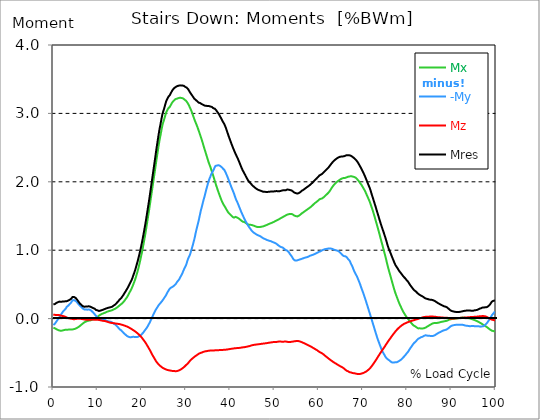
| Category |  Mx |  -My |  Mz |  Mres |
|---|---|---|---|---|
| 0.0 | -0.133 | -0.093 | 0.055 | 0.208 |
| 0.167348456675344 | -0.137 | -0.086 | 0.055 | 0.209 |
| 0.334696913350688 | -0.141 | -0.076 | 0.055 | 0.212 |
| 0.5020453700260321 | -0.148 | -0.061 | 0.052 | 0.222 |
| 0.669393826701376 | -0.154 | -0.045 | 0.052 | 0.228 |
| 0.83674228337672 | -0.159 | -0.029 | 0.052 | 0.236 |
| 1.0040907400520642 | -0.165 | -0.014 | 0.052 | 0.239 |
| 1.1621420602454444 | -0.17 | 0.001 | 0.053 | 0.244 |
| 1.3294905169207885 | -0.174 | 0.018 | 0.051 | 0.248 |
| 1.4968389735961325 | -0.176 | 0.035 | 0.047 | 0.246 |
| 1.6641874302714765 | -0.177 | 0.052 | 0.044 | 0.245 |
| 1.8315358869468206 | -0.176 | 0.069 | 0.041 | 0.245 |
| 1.9988843436221646 | -0.175 | 0.086 | 0.039 | 0.248 |
| 2.1662328002975086 | -0.173 | 0.102 | 0.037 | 0.249 |
| 2.333581256972853 | -0.169 | 0.115 | 0.035 | 0.249 |
| 2.5009297136481967 | -0.166 | 0.125 | 0.031 | 0.252 |
| 2.6682781703235405 | -0.163 | 0.137 | 0.028 | 0.253 |
| 2.8356266269988843 | -0.161 | 0.149 | 0.023 | 0.253 |
| 3.002975083674229 | -0.163 | 0.171 | 0.016 | 0.254 |
| 3.1703235403495724 | -0.162 | 0.178 | 0.013 | 0.259 |
| 3.337671997024917 | -0.161 | 0.187 | 0.008 | 0.263 |
| 3.4957233172182973 | -0.16 | 0.197 | 0.005 | 0.268 |
| 3.663071773893641 | -0.16 | 0.21 | 0.002 | 0.275 |
| 3.8304202305689854 | -0.159 | 0.222 | 0.001 | 0.281 |
| 3.997768687244329 | -0.158 | 0.234 | -0.002 | 0.289 |
| 4.165117143919673 | -0.158 | 0.251 | -0.004 | 0.303 |
| 4.332465600595017 | -0.158 | 0.268 | -0.006 | 0.316 |
| 4.499814057270361 | -0.156 | 0.273 | -0.007 | 0.32 |
| 4.667162513945706 | -0.154 | 0.271 | -0.01 | 0.316 |
| 4.834510970621049 | -0.152 | 0.266 | -0.011 | 0.312 |
| 5.001859427296393 | -0.148 | 0.26 | -0.006 | 0.304 |
| 5.169207883971737 | -0.141 | 0.252 | -0.004 | 0.293 |
| 5.336556340647081 | -0.136 | 0.24 | -0.003 | 0.28 |
| 5.503904797322425 | -0.13 | 0.226 | -0.003 | 0.264 |
| 5.671253253997769 | -0.123 | 0.212 | -0.002 | 0.249 |
| 5.82930457419115 | -0.116 | 0.202 | -0.003 | 0.237 |
| 5.996653030866494 | -0.107 | 0.188 | -0.003 | 0.221 |
| 6.164001487541838 | -0.099 | 0.178 | -0.004 | 0.209 |
| 6.331349944217181 | -0.089 | 0.17 | -0.004 | 0.2 |
| 6.498698400892526 | -0.08 | 0.158 | -0.006 | 0.19 |
| 6.66604685756787 | -0.071 | 0.148 | -0.008 | 0.182 |
| 6.833395314243213 | -0.063 | 0.139 | -0.011 | 0.176 |
| 7.000743770918558 | -0.055 | 0.134 | -0.013 | 0.173 |
| 7.168092227593902 | -0.05 | 0.132 | -0.015 | 0.174 |
| 7.335440684269246 | -0.045 | 0.133 | -0.016 | 0.176 |
| 7.50278914094459 | -0.04 | 0.132 | -0.017 | 0.176 |
| 7.6701375976199335 | -0.035 | 0.131 | -0.018 | 0.176 |
| 7.837486054295278 | -0.032 | 0.133 | -0.018 | 0.178 |
| 7.995537374488658 | -0.03 | 0.134 | -0.018 | 0.18 |
| 8.162885831164003 | -0.029 | 0.132 | -0.016 | 0.178 |
| 8.330234287839346 | -0.027 | 0.127 | -0.016 | 0.175 |
| 8.49758274451469 | -0.024 | 0.121 | -0.016 | 0.17 |
| 8.664931201190035 | -0.02 | 0.11 | -0.015 | 0.165 |
| 8.832279657865378 | -0.015 | 0.101 | -0.014 | 0.157 |
| 8.999628114540721 | -0.01 | 0.089 | -0.015 | 0.154 |
| 9.166976571216066 | -0.005 | 0.076 | -0.016 | 0.151 |
| 9.334325027891412 | 0.001 | 0.064 | -0.016 | 0.144 |
| 9.501673484566755 | 0.007 | 0.05 | -0.015 | 0.134 |
| 9.669021941242098 | 0.013 | 0.038 | -0.016 | 0.125 |
| 9.836370397917442 | 0.02 | 0.027 | -0.016 | 0.122 |
| 10.003718854592787 | 0.027 | 0.014 | -0.018 | 0.12 |
| 10.17106731126813 | 0.034 | 0 | -0.018 | 0.115 |
| 10.329118631461512 | 0.045 | -0.017 | -0.019 | 0.111 |
| 10.496467088136853 | 0.052 | -0.021 | -0.021 | 0.115 |
| 10.663815544812199 | 0.058 | -0.019 | -0.024 | 0.118 |
| 10.831164001487544 | 0.063 | -0.01 | -0.028 | 0.119 |
| 10.998512458162887 | 0.069 | -0.006 | -0.03 | 0.124 |
| 11.16586091483823 | 0.074 | -0.005 | -0.031 | 0.131 |
| 11.333209371513574 | 0.077 | -0.007 | -0.033 | 0.133 |
| 11.50055782818892 | 0.082 | -0.012 | -0.034 | 0.137 |
| 11.667906284864264 | 0.086 | -0.019 | -0.036 | 0.141 |
| 11.835254741539607 | 0.09 | -0.024 | -0.038 | 0.145 |
| 12.00260319821495 | 0.097 | -0.032 | -0.041 | 0.15 |
| 12.169951654890292 | 0.102 | -0.037 | -0.045 | 0.155 |
| 12.337300111565641 | 0.105 | -0.038 | -0.049 | 0.157 |
| 12.504648568240984 | 0.108 | -0.039 | -0.053 | 0.159 |
| 12.662699888434362 | 0.111 | -0.044 | -0.056 | 0.162 |
| 12.830048345109708 | 0.114 | -0.045 | -0.059 | 0.165 |
| 12.997396801785053 | 0.117 | -0.047 | -0.062 | 0.168 |
| 13.164745258460396 | 0.12 | -0.051 | -0.064 | 0.17 |
| 13.33209371513574 | 0.124 | -0.058 | -0.065 | 0.175 |
| 13.499442171811083 | 0.13 | -0.067 | -0.066 | 0.183 |
| 13.666790628486426 | 0.136 | -0.076 | -0.067 | 0.192 |
| 13.834139085161771 | 0.139 | -0.079 | -0.069 | 0.197 |
| 14.001487541837117 | 0.144 | -0.086 | -0.071 | 0.206 |
| 14.16883599851246 | 0.152 | -0.097 | -0.072 | 0.217 |
| 14.336184455187803 | 0.159 | -0.107 | -0.074 | 0.229 |
| 14.503532911863147 | 0.168 | -0.119 | -0.075 | 0.24 |
| 14.670881368538492 | 0.176 | -0.132 | -0.077 | 0.253 |
| 14.828932688731873 | 0.185 | -0.142 | -0.08 | 0.264 |
| 14.996281145407215 | 0.194 | -0.157 | -0.081 | 0.28 |
| 15.163629602082558 | 0.203 | -0.166 | -0.083 | 0.291 |
| 15.330978058757903 | 0.211 | -0.171 | -0.087 | 0.299 |
| 15.498326515433247 | 0.22 | -0.18 | -0.09 | 0.313 |
| 15.665674972108594 | 0.23 | -0.195 | -0.093 | 0.33 |
| 15.833023428783937 | 0.241 | -0.206 | -0.097 | 0.346 |
| 16.00037188545928 | 0.255 | -0.218 | -0.1 | 0.364 |
| 16.167720342134626 | 0.269 | -0.227 | -0.104 | 0.381 |
| 16.335068798809967 | 0.285 | -0.236 | -0.108 | 0.398 |
| 16.502417255485312 | 0.299 | -0.245 | -0.111 | 0.416 |
| 16.669765712160658 | 0.315 | -0.256 | -0.116 | 0.435 |
| 16.837114168836 | 0.333 | -0.26 | -0.121 | 0.453 |
| 17.004462625511344 | 0.355 | -0.265 | -0.127 | 0.476 |
| 17.16251394570472 | 0.376 | -0.27 | -0.133 | 0.497 |
| 17.32986240238007 | 0.395 | -0.273 | -0.139 | 0.517 |
| 17.497210859055414 | 0.414 | -0.274 | -0.145 | 0.538 |
| 17.664559315730756 | 0.436 | -0.271 | -0.152 | 0.561 |
| 17.8319077724061 | 0.461 | -0.263 | -0.159 | 0.587 |
| 17.999256229081443 | 0.487 | -0.266 | -0.167 | 0.617 |
| 18.166604685756788 | 0.516 | -0.272 | -0.173 | 0.649 |
| 18.333953142432133 | 0.544 | -0.268 | -0.179 | 0.678 |
| 18.501301599107478 | 0.573 | -0.266 | -0.188 | 0.711 |
| 18.668650055782823 | 0.608 | -0.269 | -0.196 | 0.748 |
| 18.835998512458165 | 0.645 | -0.269 | -0.205 | 0.787 |
| 19.00334696913351 | 0.682 | -0.269 | -0.213 | 0.826 |
| 19.170695425808855 | 0.721 | -0.266 | -0.223 | 0.865 |
| 19.338043882484197 | 0.764 | -0.259 | -0.232 | 0.909 |
| 19.496095202677576 | 0.811 | -0.257 | -0.243 | 0.953 |
| 19.66344365935292 | 0.859 | -0.251 | -0.254 | 1.001 |
| 19.830792116028263 | 0.91 | -0.24 | -0.265 | 1.05 |
| 19.998140572703612 | 0.961 | -0.227 | -0.278 | 1.103 |
| 20.165489029378953 | 1.014 | -0.213 | -0.293 | 1.158 |
| 20.3328374860543 | 1.071 | -0.204 | -0.307 | 1.214 |
| 20.500185942729644 | 1.131 | -0.189 | -0.322 | 1.274 |
| 20.667534399404985 | 1.19 | -0.174 | -0.337 | 1.334 |
| 20.83488285608033 | 1.254 | -0.159 | -0.352 | 1.397 |
| 21.002231312755672 | 1.321 | -0.145 | -0.369 | 1.463 |
| 21.16957976943102 | 1.391 | -0.131 | -0.387 | 1.532 |
| 21.336928226106362 | 1.459 | -0.111 | -0.406 | 1.6 |
| 21.504276682781704 | 1.527 | -0.092 | -0.425 | 1.668 |
| 21.67162513945705 | 1.596 | -0.072 | -0.443 | 1.738 |
| 21.82967645965043 | 1.669 | -0.052 | -0.462 | 1.811 |
| 21.997024916325774 | 1.742 | -0.028 | -0.483 | 1.886 |
| 22.16437337300112 | 1.815 | -0.003 | -0.503 | 1.963 |
| 22.33172182967646 | 1.886 | 0.019 | -0.524 | 2.036 |
| 22.499070286351806 | 1.96 | 0.044 | -0.544 | 2.111 |
| 22.666418743027148 | 2.033 | 0.066 | -0.562 | 2.187 |
| 22.833767199702496 | 2.106 | 0.088 | -0.58 | 2.262 |
| 23.00111565637784 | 2.18 | 0.109 | -0.599 | 2.339 |
| 23.168464113053183 | 2.255 | 0.131 | -0.618 | 2.417 |
| 23.335812569728528 | 2.33 | 0.148 | -0.634 | 2.493 |
| 23.50316102640387 | 2.401 | 0.165 | -0.646 | 2.564 |
| 23.670509483079215 | 2.471 | 0.182 | -0.66 | 2.635 |
| 23.83785793975456 | 2.542 | 0.199 | -0.673 | 2.705 |
| 23.995909259947936 | 2.607 | 0.211 | -0.683 | 2.77 |
| 24.163257716623285 | 2.66 | 0.224 | -0.692 | 2.823 |
| 24.330606173298627 | 2.719 | 0.237 | -0.701 | 2.88 |
| 24.49795462997397 | 2.778 | 0.249 | -0.709 | 2.938 |
| 24.665303086649313 | 2.832 | 0.262 | -0.718 | 2.993 |
| 24.83265154332466 | 2.868 | 0.279 | -0.723 | 3.028 |
| 25.0 | 2.902 | 0.296 | -0.728 | 3.062 |
| 25.167348456675345 | 2.938 | 0.31 | -0.734 | 3.099 |
| 25.334696913350694 | 2.977 | 0.328 | -0.74 | 3.138 |
| 25.502045370026035 | 3.013 | 0.345 | -0.745 | 3.175 |
| 25.669393826701377 | 3.036 | 0.366 | -0.748 | 3.2 |
| 25.836742283376722 | 3.056 | 0.387 | -0.752 | 3.221 |
| 26.004090740052067 | 3.075 | 0.404 | -0.754 | 3.242 |
| 26.17143919672741 | 3.085 | 0.423 | -0.757 | 3.254 |
| 26.329490516920792 | 3.097 | 0.438 | -0.759 | 3.268 |
| 26.49683897359613 | 3.116 | 0.448 | -0.76 | 3.289 |
| 26.66418743027148 | 3.136 | 0.455 | -0.762 | 3.309 |
| 26.831535886946828 | 3.155 | 0.461 | -0.765 | 3.329 |
| 26.998884343622166 | 3.17 | 0.466 | -0.766 | 3.345 |
| 27.166232800297514 | 3.184 | 0.473 | -0.766 | 3.36 |
| 27.333581256972852 | 3.192 | 0.484 | -0.766 | 3.369 |
| 27.5009297136482 | 3.202 | 0.495 | -0.769 | 3.379 |
| 27.668278170323543 | 3.211 | 0.504 | -0.77 | 3.39 |
| 27.835626626998888 | 3.213 | 0.521 | -0.769 | 3.394 |
| 28.002975083674233 | 3.217 | 0.538 | -0.766 | 3.397 |
| 28.170323540349575 | 3.222 | 0.552 | -0.763 | 3.402 |
| 28.33767199702492 | 3.225 | 0.564 | -0.759 | 3.406 |
| 28.50502045370026 | 3.228 | 0.58 | -0.754 | 3.409 |
| 28.663071773893645 | 3.229 | 0.601 | -0.749 | 3.411 |
| 28.830420230568986 | 3.228 | 0.621 | -0.743 | 3.41 |
| 28.99776868724433 | 3.225 | 0.64 | -0.736 | 3.409 |
| 29.165117143919673 | 3.222 | 0.662 | -0.727 | 3.408 |
| 29.33246560059502 | 3.219 | 0.689 | -0.72 | 3.407 |
| 29.499814057270367 | 3.212 | 0.714 | -0.711 | 3.403 |
| 29.66716251394571 | 3.202 | 0.739 | -0.702 | 3.396 |
| 29.834510970621054 | 3.19 | 0.759 | -0.69 | 3.386 |
| 30.00185942729639 | 3.184 | 0.781 | -0.679 | 3.382 |
| 30.169207883971744 | 3.172 | 0.814 | -0.67 | 3.376 |
| 30.33655634064708 | 3.155 | 0.851 | -0.661 | 3.366 |
| 30.50390479732243 | 3.136 | 0.88 | -0.649 | 3.351 |
| 30.671253253997772 | 3.115 | 0.904 | -0.635 | 3.333 |
| 30.829304574191156 | 3.091 | 0.927 | -0.621 | 3.314 |
| 30.996653030866494 | 3.068 | 0.956 | -0.608 | 3.298 |
| 31.164001487541842 | 3.044 | 0.998 | -0.6 | 3.285 |
| 31.331349944217187 | 3.015 | 1.031 | -0.589 | 3.266 |
| 31.498698400892525 | 2.985 | 1.068 | -0.58 | 3.251 |
| 31.666046857567874 | 2.953 | 1.11 | -0.571 | 3.235 |
| 31.833395314243212 | 2.923 | 1.15 | -0.562 | 3.218 |
| 32.00074377091856 | 2.894 | 1.195 | -0.553 | 3.204 |
| 32.1680922275939 | 2.867 | 1.248 | -0.547 | 3.199 |
| 32.33544068426925 | 2.841 | 1.296 | -0.539 | 3.19 |
| 32.50278914094459 | 2.813 | 1.341 | -0.531 | 3.179 |
| 32.670137597619934 | 2.785 | 1.383 | -0.523 | 3.17 |
| 32.83748605429528 | 2.753 | 1.425 | -0.517 | 3.158 |
| 33.004834510970625 | 2.721 | 1.477 | -0.51 | 3.155 |
| 33.162885831164004 | 2.689 | 1.527 | -0.505 | 3.152 |
| 33.33023428783935 | 2.656 | 1.576 | -0.501 | 3.145 |
| 33.497582744514695 | 2.624 | 1.618 | -0.498 | 3.138 |
| 33.664931201190036 | 2.59 | 1.66 | -0.494 | 3.131 |
| 33.83227965786538 | 2.555 | 1.705 | -0.49 | 3.127 |
| 33.99962811454073 | 2.517 | 1.744 | -0.484 | 3.122 |
| 34.16697657121607 | 2.481 | 1.781 | -0.481 | 3.115 |
| 34.33432502789141 | 2.447 | 1.826 | -0.479 | 3.113 |
| 34.50167348456676 | 2.412 | 1.868 | -0.477 | 3.111 |
| 34.6690219412421 | 2.377 | 1.909 | -0.476 | 3.109 |
| 34.83637039791744 | 2.342 | 1.948 | -0.473 | 3.108 |
| 35.00371885459279 | 2.307 | 1.987 | -0.471 | 3.107 |
| 35.17106731126814 | 2.274 | 2.022 | -0.469 | 3.107 |
| 35.338415767943474 | 2.245 | 2.051 | -0.468 | 3.105 |
| 35.49646708813686 | 2.218 | 2.075 | -0.467 | 3.101 |
| 35.6638155448122 | 2.185 | 2.106 | -0.467 | 3.1 |
| 35.831164001487544 | 2.151 | 2.13 | -0.467 | 3.094 |
| 35.998512458162885 | 2.118 | 2.148 | -0.466 | 3.085 |
| 36.165860914838234 | 2.085 | 2.166 | -0.466 | 3.076 |
| 36.333209371513576 | 2.048 | 2.19 | -0.465 | 3.071 |
| 36.50055782818892 | 2.012 | 2.215 | -0.465 | 3.069 |
| 36.667906284864266 | 1.977 | 2.232 | -0.464 | 3.062 |
| 36.83525474153961 | 1.944 | 2.235 | -0.464 | 3.045 |
| 37.002603198214956 | 1.912 | 2.238 | -0.463 | 3.029 |
| 37.1699516548903 | 1.879 | 2.242 | -0.463 | 3.015 |
| 37.337300111565646 | 1.848 | 2.243 | -0.462 | 2.999 |
| 37.50464856824098 | 1.818 | 2.24 | -0.461 | 2.981 |
| 37.66269988843437 | 1.789 | 2.234 | -0.46 | 2.961 |
| 37.83004834510971 | 1.76 | 2.226 | -0.46 | 2.941 |
| 37.99739680178505 | 1.731 | 2.218 | -0.459 | 2.919 |
| 38.16474525846039 | 1.708 | 2.205 | -0.458 | 2.898 |
| 38.33209371513574 | 1.685 | 2.194 | -0.458 | 2.877 |
| 38.49944217181109 | 1.665 | 2.185 | -0.458 | 2.861 |
| 38.666790628486424 | 1.648 | 2.172 | -0.456 | 2.841 |
| 38.83413908516178 | 1.631 | 2.152 | -0.455 | 2.816 |
| 39.001487541837115 | 1.61 | 2.131 | -0.454 | 2.789 |
| 39.16883599851246 | 1.592 | 2.103 | -0.453 | 2.756 |
| 39.336184455187805 | 1.573 | 2.079 | -0.451 | 2.725 |
| 39.503532911863154 | 1.556 | 2.051 | -0.45 | 2.694 |
| 39.670881368538495 | 1.544 | 2.02 | -0.448 | 2.661 |
| 39.83822982521384 | 1.532 | 1.993 | -0.446 | 2.633 |
| 39.996281145407224 | 1.52 | 1.964 | -0.444 | 2.603 |
| 40.163629602082565 | 1.51 | 1.936 | -0.443 | 2.573 |
| 40.33097805875791 | 1.499 | 1.909 | -0.441 | 2.545 |
| 40.498326515433256 | 1.488 | 1.883 | -0.438 | 2.517 |
| 40.6656749721086 | 1.48 | 1.856 | -0.437 | 2.488 |
| 40.83302342878393 | 1.477 | 1.83 | -0.435 | 2.464 |
| 41.00037188545929 | 1.484 | 1.796 | -0.434 | 2.437 |
| 41.16772034213463 | 1.487 | 1.765 | -0.433 | 2.413 |
| 41.33506879880997 | 1.488 | 1.737 | -0.432 | 2.391 |
| 41.50241725548531 | 1.479 | 1.714 | -0.431 | 2.366 |
| 41.66976571216066 | 1.475 | 1.691 | -0.43 | 2.346 |
| 41.837114168836 | 1.467 | 1.665 | -0.43 | 2.32 |
| 42.004462625511344 | 1.46 | 1.638 | -0.429 | 2.294 |
| 42.17181108218669 | 1.451 | 1.61 | -0.428 | 2.268 |
| 42.32986240238007 | 1.442 | 1.583 | -0.426 | 2.24 |
| 42.497210859055414 | 1.432 | 1.556 | -0.425 | 2.212 |
| 42.66455931573076 | 1.423 | 1.533 | -0.421 | 2.188 |
| 42.831907772406105 | 1.417 | 1.508 | -0.42 | 2.165 |
| 42.999256229081446 | 1.414 | 1.486 | -0.419 | 2.145 |
| 43.16660468575679 | 1.412 | 1.463 | -0.417 | 2.125 |
| 43.33395314243214 | 1.407 | 1.442 | -0.416 | 2.105 |
| 43.50130159910748 | 1.398 | 1.42 | -0.414 | 2.083 |
| 43.66865005578282 | 1.391 | 1.401 | -0.412 | 2.063 |
| 43.83599851245817 | 1.382 | 1.382 | -0.41 | 2.042 |
| 44.00334696913351 | 1.377 | 1.363 | -0.407 | 2.024 |
| 44.17069542580886 | 1.373 | 1.346 | -0.406 | 2.007 |
| 44.3380438824842 | 1.373 | 1.331 | -0.402 | 1.996 |
| 44.49609520267758 | 1.373 | 1.316 | -0.398 | 1.985 |
| 44.66344365935292 | 1.372 | 1.301 | -0.395 | 1.972 |
| 44.83079211602827 | 1.368 | 1.287 | -0.392 | 1.96 |
| 44.99814057270361 | 1.366 | 1.274 | -0.389 | 1.947 |
| 45.16548902937895 | 1.362 | 1.263 | -0.386 | 1.937 |
| 45.332837486054295 | 1.358 | 1.254 | -0.384 | 1.927 |
| 45.500185942729644 | 1.354 | 1.248 | -0.382 | 1.919 |
| 45.66753439940499 | 1.349 | 1.243 | -0.381 | 1.912 |
| 45.83488285608033 | 1.345 | 1.234 | -0.38 | 1.901 |
| 46.00223131275568 | 1.341 | 1.228 | -0.378 | 1.894 |
| 46.16957976943102 | 1.339 | 1.222 | -0.377 | 1.887 |
| 46.336928226106366 | 1.34 | 1.217 | -0.376 | 1.882 |
| 46.50427668278171 | 1.34 | 1.212 | -0.374 | 1.878 |
| 46.671625139457056 | 1.34 | 1.207 | -0.373 | 1.875 |
| 46.829676459650436 | 1.341 | 1.202 | -0.37 | 1.87 |
| 46.99702491632577 | 1.343 | 1.194 | -0.369 | 1.866 |
| 47.16437337300112 | 1.345 | 1.187 | -0.368 | 1.862 |
| 47.33172182967646 | 1.347 | 1.179 | -0.366 | 1.858 |
| 47.49907028635181 | 1.349 | 1.173 | -0.365 | 1.854 |
| 47.66641874302716 | 1.355 | 1.169 | -0.364 | 1.854 |
| 47.83376719970249 | 1.359 | 1.163 | -0.363 | 1.854 |
| 48.001115656377834 | 1.363 | 1.158 | -0.361 | 1.852 |
| 48.16846411305319 | 1.366 | 1.153 | -0.36 | 1.851 |
| 48.33581256972853 | 1.372 | 1.148 | -0.358 | 1.851 |
| 48.50316102640387 | 1.377 | 1.144 | -0.356 | 1.852 |
| 48.67050948307921 | 1.381 | 1.142 | -0.354 | 1.854 |
| 48.837857939754564 | 1.386 | 1.138 | -0.352 | 1.856 |
| 49.005206396429905 | 1.392 | 1.136 | -0.35 | 1.857 |
| 49.163257716623285 | 1.395 | 1.132 | -0.348 | 1.857 |
| 49.33060617329863 | 1.399 | 1.127 | -0.347 | 1.857 |
| 49.49795462997397 | 1.403 | 1.122 | -0.345 | 1.857 |
| 49.66530308664932 | 1.409 | 1.118 | -0.344 | 1.858 |
| 49.832651543324666 | 1.413 | 1.113 | -0.344 | 1.859 |
| 50.0 | 1.418 | 1.107 | -0.343 | 1.86 |
| 50.16734845667534 | 1.425 | 1.104 | -0.343 | 1.863 |
| 50.33469691335069 | 1.431 | 1.101 | -0.343 | 1.866 |
| 50.50204537002604 | 1.436 | 1.091 | -0.34 | 1.864 |
| 50.66939382670139 | 1.442 | 1.083 | -0.339 | 1.863 |
| 50.836742283376715 | 1.446 | 1.072 | -0.335 | 1.861 |
| 51.00409074005207 | 1.452 | 1.066 | -0.335 | 1.864 |
| 51.17143919672741 | 1.459 | 1.057 | -0.335 | 1.863 |
| 51.32949051692079 | 1.465 | 1.051 | -0.335 | 1.865 |
| 51.496838973596134 | 1.471 | 1.046 | -0.337 | 1.868 |
| 51.66418743027148 | 1.477 | 1.044 | -0.338 | 1.873 |
| 51.831535886946824 | 1.483 | 1.039 | -0.338 | 1.875 |
| 51.99888434362217 | 1.489 | 1.033 | -0.338 | 1.877 |
| 52.16623280029752 | 1.495 | 1.022 | -0.338 | 1.877 |
| 52.33358125697285 | 1.501 | 1.011 | -0.335 | 1.875 |
| 52.5009297136482 | 1.507 | 1.001 | -0.335 | 1.876 |
| 52.668278170323546 | 1.514 | 0.999 | -0.337 | 1.882 |
| 52.835626626998895 | 1.519 | 0.996 | -0.339 | 1.886 |
| 53.00297508367424 | 1.523 | 0.988 | -0.341 | 1.887 |
| 53.17032354034958 | 1.525 | 0.976 | -0.342 | 1.885 |
| 53.33767199702492 | 1.528 | 0.962 | -0.342 | 1.883 |
| 53.50502045370027 | 1.53 | 0.944 | -0.341 | 1.88 |
| 53.663071773893655 | 1.531 | 0.93 | -0.341 | 1.878 |
| 53.83042023056899 | 1.531 | 0.915 | -0.34 | 1.875 |
| 53.99776868724433 | 1.529 | 0.898 | -0.338 | 1.869 |
| 54.16511714391967 | 1.52 | 0.88 | -0.335 | 1.859 |
| 54.33246560059503 | 1.511 | 0.864 | -0.333 | 1.849 |
| 54.49981405727037 | 1.505 | 0.854 | -0.333 | 1.842 |
| 54.667162513945705 | 1.501 | 0.848 | -0.331 | 1.838 |
| 54.834510970621054 | 1.498 | 0.847 | -0.328 | 1.834 |
| 55.0018594272964 | 1.494 | 0.849 | -0.326 | 1.83 |
| 55.169207883971744 | 1.494 | 0.85 | -0.326 | 1.828 |
| 55.336556340647086 | 1.497 | 0.856 | -0.327 | 1.829 |
| 55.50390479732243 | 1.503 | 0.859 | -0.33 | 1.834 |
| 55.671253253997776 | 1.511 | 0.864 | -0.332 | 1.841 |
| 55.83860171067312 | 1.519 | 0.865 | -0.337 | 1.849 |
| 55.9966530308665 | 1.53 | 0.869 | -0.341 | 1.86 |
| 56.16400148754184 | 1.538 | 0.874 | -0.345 | 1.868 |
| 56.33134994421718 | 1.546 | 0.878 | -0.349 | 1.874 |
| 56.498698400892536 | 1.553 | 0.881 | -0.355 | 1.881 |
| 56.66604685756788 | 1.562 | 0.885 | -0.359 | 1.89 |
| 56.83339531424321 | 1.569 | 0.889 | -0.364 | 1.897 |
| 57.00074377091856 | 1.576 | 0.893 | -0.369 | 1.906 |
| 57.16809222759391 | 1.584 | 0.897 | -0.375 | 1.913 |
| 57.33544068426925 | 1.591 | 0.898 | -0.38 | 1.92 |
| 57.5027891409446 | 1.6 | 0.902 | -0.386 | 1.929 |
| 57.670137597619934 | 1.607 | 0.906 | -0.392 | 1.936 |
| 57.83748605429528 | 1.615 | 0.911 | -0.396 | 1.944 |
| 58.004834510970625 | 1.621 | 0.918 | -0.401 | 1.952 |
| 58.16288583116401 | 1.631 | 0.923 | -0.407 | 1.963 |
| 58.330234287839346 | 1.64 | 0.926 | -0.412 | 1.972 |
| 58.497582744514695 | 1.65 | 0.929 | -0.418 | 1.982 |
| 58.66493120119004 | 1.66 | 0.932 | -0.426 | 1.994 |
| 58.832279657865385 | 1.671 | 0.937 | -0.432 | 2.004 |
| 58.999628114540734 | 1.68 | 0.942 | -0.438 | 2.016 |
| 59.16697657121607 | 1.69 | 0.947 | -0.446 | 2.028 |
| 59.33432502789142 | 1.697 | 0.952 | -0.451 | 2.037 |
| 59.50167348456676 | 1.706 | 0.958 | -0.456 | 2.047 |
| 59.66902194124211 | 1.714 | 0.963 | -0.464 | 2.057 |
| 59.83637039791745 | 1.724 | 0.969 | -0.472 | 2.07 |
| 60.00371885459278 | 1.734 | 0.975 | -0.481 | 2.082 |
| 60.17106731126813 | 1.744 | 0.978 | -0.488 | 2.093 |
| 60.33841576794349 | 1.748 | 0.982 | -0.494 | 2.1 |
| 60.49646708813685 | 1.752 | 0.987 | -0.499 | 2.105 |
| 60.6638155448122 | 1.755 | 0.995 | -0.504 | 2.11 |
| 60.831164001487544 | 1.759 | 1.001 | -0.512 | 2.119 |
| 60.99851245816289 | 1.768 | 1.005 | -0.519 | 2.128 |
| 61.16586091483824 | 1.777 | 1.011 | -0.529 | 2.141 |
| 61.333209371513576 | 1.788 | 1.014 | -0.537 | 2.153 |
| 61.50055782818892 | 1.798 | 1.016 | -0.546 | 2.163 |
| 61.667906284864266 | 1.808 | 1.018 | -0.555 | 2.174 |
| 61.835254741539615 | 1.817 | 1.02 | -0.564 | 2.184 |
| 62.002603198214956 | 1.827 | 1.022 | -0.572 | 2.194 |
| 62.16995165489029 | 1.839 | 1.024 | -0.581 | 2.206 |
| 62.33730011156564 | 1.851 | 1.025 | -0.589 | 2.22 |
| 62.504648568240995 | 1.865 | 1.027 | -0.598 | 2.234 |
| 62.67199702491633 | 1.882 | 1.025 | -0.605 | 2.248 |
| 62.83004834510971 | 1.9 | 1.022 | -0.614 | 2.263 |
| 62.99739680178505 | 1.917 | 1.02 | -0.621 | 2.277 |
| 63.1647452584604 | 1.932 | 1.015 | -0.628 | 2.289 |
| 63.33209371513575 | 1.947 | 1.011 | -0.636 | 2.3 |
| 63.4994421718111 | 1.96 | 1.006 | -0.642 | 2.311 |
| 63.666790628486424 | 1.971 | 1.003 | -0.65 | 2.321 |
| 63.83413908516177 | 1.983 | 0.999 | -0.656 | 2.329 |
| 64.00148754183712 | 1.993 | 0.997 | -0.662 | 2.338 |
| 64.16883599851248 | 2.002 | 0.993 | -0.67 | 2.345 |
| 64.3361844551878 | 2.01 | 0.99 | -0.676 | 2.352 |
| 64.50353291186315 | 2.018 | 0.985 | -0.683 | 2.358 |
| 64.6708813685385 | 2.025 | 0.977 | -0.689 | 2.363 |
| 64.83822982521384 | 2.033 | 0.966 | -0.694 | 2.366 |
| 65.00557828188919 | 2.04 | 0.954 | -0.701 | 2.368 |
| 65.16362960208257 | 2.047 | 0.942 | -0.706 | 2.369 |
| 65.3309780587579 | 2.05 | 0.931 | -0.712 | 2.37 |
| 65.49832651543326 | 2.054 | 0.919 | -0.719 | 2.372 |
| 65.6656749721086 | 2.056 | 0.914 | -0.726 | 2.374 |
| 65.83302342878395 | 2.056 | 0.912 | -0.736 | 2.376 |
| 66.00037188545929 | 2.057 | 0.912 | -0.746 | 2.381 |
| 66.16772034213463 | 2.061 | 0.911 | -0.757 | 2.386 |
| 66.33506879880998 | 2.066 | 0.898 | -0.762 | 2.389 |
| 66.50241725548531 | 2.071 | 0.883 | -0.769 | 2.39 |
| 66.66976571216065 | 2.074 | 0.867 | -0.772 | 2.389 |
| 66.83711416883601 | 2.076 | 0.857 | -0.778 | 2.389 |
| 67.00446262551135 | 2.079 | 0.846 | -0.785 | 2.39 |
| 67.1718110821867 | 2.081 | 0.821 | -0.787 | 2.383 |
| 67.32986240238007 | 2.082 | 0.795 | -0.788 | 2.378 |
| 67.49721085905541 | 2.08 | 0.776 | -0.792 | 2.372 |
| 67.66455931573076 | 2.076 | 0.753 | -0.796 | 2.364 |
| 67.83190777240611 | 2.074 | 0.723 | -0.796 | 2.355 |
| 67.99925622908145 | 2.071 | 0.696 | -0.798 | 2.346 |
| 68.16660468575678 | 2.067 | 0.674 | -0.8 | 2.337 |
| 68.33395314243214 | 2.061 | 0.653 | -0.804 | 2.327 |
| 68.50130159910749 | 2.05 | 0.634 | -0.806 | 2.314 |
| 68.66865005578282 | 2.039 | 0.613 | -0.808 | 2.3 |
| 68.83599851245816 | 2.028 | 0.587 | -0.81 | 2.285 |
| 69.00334696913352 | 2.015 | 0.561 | -0.811 | 2.266 |
| 69.17069542580886 | 2 | 0.534 | -0.811 | 2.247 |
| 69.3380438824842 | 1.984 | 0.507 | -0.81 | 2.227 |
| 69.50539233915956 | 1.97 | 0.475 | -0.807 | 2.209 |
| 69.66344365935292 | 1.954 | 0.444 | -0.804 | 2.188 |
| 69.83079211602826 | 1.937 | 0.415 | -0.801 | 2.167 |
| 69.99814057270362 | 1.918 | 0.386 | -0.798 | 2.145 |
| 70.16548902937896 | 1.9 | 0.355 | -0.793 | 2.122 |
| 70.33283748605429 | 1.881 | 0.322 | -0.788 | 2.099 |
| 70.50018594272964 | 1.861 | 0.29 | -0.783 | 2.074 |
| 70.667534399405 | 1.837 | 0.258 | -0.776 | 2.047 |
| 70.83488285608033 | 1.812 | 0.223 | -0.77 | 2.02 |
| 71.00223131275568 | 1.789 | 0.189 | -0.761 | 1.994 |
| 71.16957976943102 | 1.763 | 0.155 | -0.753 | 1.967 |
| 71.33692822610637 | 1.739 | 0.119 | -0.742 | 1.941 |
| 71.50427668278171 | 1.714 | 0.086 | -0.732 | 1.915 |
| 71.67162513945706 | 1.685 | 0.051 | -0.721 | 1.884 |
| 71.8389735961324 | 1.653 | 0.016 | -0.707 | 1.849 |
| 71.99702491632577 | 1.621 | -0.019 | -0.693 | 1.813 |
| 72.16437337300113 | 1.59 | -0.055 | -0.679 | 1.781 |
| 72.33172182967647 | 1.555 | -0.09 | -0.663 | 1.745 |
| 72.49907028635181 | 1.52 | -0.125 | -0.649 | 1.711 |
| 72.66641874302715 | 1.483 | -0.161 | -0.632 | 1.676 |
| 72.8337671997025 | 1.445 | -0.197 | -0.616 | 1.642 |
| 73.00111565637783 | 1.407 | -0.231 | -0.6 | 1.606 |
| 73.16846411305319 | 1.368 | -0.266 | -0.582 | 1.569 |
| 73.33581256972853 | 1.331 | -0.299 | -0.565 | 1.534 |
| 73.50316102640387 | 1.292 | -0.329 | -0.548 | 1.5 |
| 73.67050948307921 | 1.252 | -0.358 | -0.531 | 1.463 |
| 73.83785793975457 | 1.212 | -0.387 | -0.514 | 1.427 |
| 74.00520639642991 | 1.17 | -0.415 | -0.498 | 1.393 |
| 74.16325771662328 | 1.13 | -0.444 | -0.481 | 1.359 |
| 74.33060617329863 | 1.09 | -0.467 | -0.464 | 1.328 |
| 74.49795462997398 | 1.051 | -0.492 | -0.448 | 1.295 |
| 74.66530308664932 | 1.008 | -0.51 | -0.434 | 1.264 |
| 74.83265154332466 | 0.968 | -0.528 | -0.418 | 1.23 |
| 75.00000000000001 | 0.927 | -0.549 | -0.401 | 1.197 |
| 75.16734845667534 | 0.884 | -0.565 | -0.384 | 1.162 |
| 75.3346969133507 | 0.84 | -0.58 | -0.367 | 1.127 |
| 75.50204537002605 | 0.794 | -0.589 | -0.351 | 1.088 |
| 75.66939382670138 | 0.752 | -0.598 | -0.335 | 1.054 |
| 75.83674228337672 | 0.711 | -0.604 | -0.32 | 1.022 |
| 76.00409074005208 | 0.673 | -0.613 | -0.305 | 0.996 |
| 76.17143919672742 | 0.636 | -0.622 | -0.29 | 0.969 |
| 76.33878765340276 | 0.597 | -0.632 | -0.275 | 0.943 |
| 76.49683897359614 | 0.557 | -0.638 | -0.259 | 0.915 |
| 76.66418743027148 | 0.519 | -0.643 | -0.244 | 0.887 |
| 76.83153588694682 | 0.48 | -0.645 | -0.23 | 0.862 |
| 76.99888434362218 | 0.443 | -0.642 | -0.217 | 0.834 |
| 77.16623280029752 | 0.407 | -0.64 | -0.203 | 0.808 |
| 77.33358125697285 | 0.374 | -0.637 | -0.189 | 0.785 |
| 77.5009297136482 | 0.344 | -0.636 | -0.176 | 0.766 |
| 77.66827817032356 | 0.315 | -0.637 | -0.163 | 0.752 |
| 77.83562662699889 | 0.287 | -0.634 | -0.152 | 0.736 |
| 78.00297508367423 | 0.258 | -0.626 | -0.141 | 0.717 |
| 78.17032354034959 | 0.23 | -0.62 | -0.132 | 0.699 |
| 78.33767199702493 | 0.206 | -0.613 | -0.122 | 0.685 |
| 78.50502045370027 | 0.183 | -0.606 | -0.113 | 0.672 |
| 78.67236891037561 | 0.159 | -0.598 | -0.104 | 0.659 |
| 78.83042023056899 | 0.136 | -0.587 | -0.097 | 0.643 |
| 78.99776868724433 | 0.115 | -0.575 | -0.089 | 0.628 |
| 79.16511714391969 | 0.094 | -0.564 | -0.082 | 0.615 |
| 79.33246560059503 | 0.076 | -0.552 | -0.075 | 0.603 |
| 79.49981405727036 | 0.058 | -0.54 | -0.071 | 0.593 |
| 79.66716251394571 | 0.041 | -0.528 | -0.067 | 0.581 |
| 79.83451097062107 | 0.024 | -0.513 | -0.062 | 0.565 |
| 80.00185942729641 | 0.011 | -0.5 | -0.056 | 0.552 |
| 80.16920788397174 | -0.002 | -0.487 | -0.052 | 0.541 |
| 80.33655634064709 | -0.016 | -0.472 | -0.048 | 0.527 |
| 80.50390479732243 | -0.031 | -0.453 | -0.044 | 0.508 |
| 80.67125325399778 | -0.045 | -0.436 | -0.04 | 0.492 |
| 80.83860171067312 | -0.056 | -0.421 | -0.036 | 0.478 |
| 80.99665303086651 | -0.07 | -0.407 | -0.033 | 0.463 |
| 81.16400148754184 | -0.083 | -0.391 | -0.03 | 0.449 |
| 81.3313499442172 | -0.094 | -0.374 | -0.027 | 0.433 |
| 81.49869840089255 | -0.103 | -0.36 | -0.023 | 0.419 |
| 81.66604685756786 | -0.109 | -0.35 | -0.02 | 0.411 |
| 81.83339531424322 | -0.114 | -0.344 | -0.016 | 0.406 |
| 82.00074377091858 | -0.122 | -0.331 | -0.013 | 0.395 |
| 82.16809222759392 | -0.131 | -0.316 | -0.01 | 0.382 |
| 82.33544068426926 | -0.138 | -0.305 | -0.007 | 0.372 |
| 82.50278914094459 | -0.143 | -0.295 | -0.004 | 0.362 |
| 82.67013759761994 | -0.143 | -0.289 | 0 | 0.355 |
| 82.83748605429528 | -0.142 | -0.283 | 0.003 | 0.347 |
| 83.00483451097062 | -0.143 | -0.278 | 0.007 | 0.341 |
| 83.17218296764597 | -0.144 | -0.272 | 0.011 | 0.334 |
| 83.33023428783935 | -0.145 | -0.268 | 0.015 | 0.329 |
| 83.4975827445147 | -0.144 | -0.264 | 0.018 | 0.324 |
| 83.66493120119004 | -0.142 | -0.259 | 0.021 | 0.316 |
| 83.83227965786537 | -0.14 | -0.252 | 0.022 | 0.308 |
| 83.99962811454073 | -0.137 | -0.246 | 0.024 | 0.299 |
| 84.16697657121607 | -0.132 | -0.243 | 0.025 | 0.294 |
| 84.33432502789142 | -0.125 | -0.244 | 0.027 | 0.291 |
| 84.50167348456677 | -0.118 | -0.248 | 0.028 | 0.288 |
| 84.6690219412421 | -0.11 | -0.252 | 0.029 | 0.286 |
| 84.83637039791745 | -0.105 | -0.252 | 0.029 | 0.282 |
| 85.0037188545928 | -0.097 | -0.252 | 0.029 | 0.278 |
| 85.17106731126813 | -0.091 | -0.253 | 0.03 | 0.277 |
| 85.33841576794349 | -0.085 | -0.255 | 0.031 | 0.276 |
| 85.50576422461883 | -0.08 | -0.255 | 0.03 | 0.275 |
| 85.66381554481221 | -0.074 | -0.255 | 0.03 | 0.273 |
| 85.83116400148755 | -0.069 | -0.254 | 0.03 | 0.27 |
| 85.99851245816289 | -0.067 | -0.251 | 0.029 | 0.265 |
| 86.16586091483823 | -0.065 | -0.246 | 0.027 | 0.26 |
| 86.33320937151358 | -0.065 | -0.24 | 0.027 | 0.254 |
| 86.50055782818893 | -0.065 | -0.232 | 0.024 | 0.246 |
| 86.66790628486427 | -0.064 | -0.226 | 0.023 | 0.239 |
| 86.83525474153961 | -0.063 | -0.219 | 0.022 | 0.232 |
| 87.00260319821496 | -0.061 | -0.212 | 0.02 | 0.225 |
| 87.16995165489031 | -0.058 | -0.206 | 0.019 | 0.219 |
| 87.33730011156564 | -0.055 | -0.202 | 0.019 | 0.213 |
| 87.504648568241 | -0.052 | -0.196 | 0.018 | 0.208 |
| 87.67199702491634 | -0.05 | -0.191 | 0.017 | 0.202 |
| 87.83004834510972 | -0.047 | -0.185 | 0.016 | 0.195 |
| 87.99739680178506 | -0.045 | -0.179 | 0.015 | 0.19 |
| 88.1647452584604 | -0.042 | -0.174 | 0.014 | 0.185 |
| 88.33209371513574 | -0.039 | -0.17 | 0.014 | 0.18 |
| 88.49944217181108 | -0.038 | -0.168 | 0.014 | 0.177 |
| 88.66679062848644 | -0.036 | -0.165 | 0.014 | 0.174 |
| 88.83413908516178 | -0.034 | -0.161 | 0.013 | 0.17 |
| 89.00148754183712 | -0.032 | -0.156 | 0.013 | 0.165 |
| 89.16883599851246 | -0.027 | -0.149 | 0.01 | 0.156 |
| 89.33618445518782 | -0.02 | -0.14 | 0.006 | 0.146 |
| 89.50353291186315 | -0.016 | -0.131 | 0.002 | 0.136 |
| 89.6708813685385 | -0.013 | -0.121 | 0 | 0.126 |
| 89.83822982521386 | -0.01 | -0.113 | -0.001 | 0.118 |
| 90.00557828188919 | -0.007 | -0.106 | -0.001 | 0.113 |
| 90.16362960208257 | -0.006 | -0.102 | 0 | 0.108 |
| 90.3309780587579 | -0.006 | -0.099 | 0.001 | 0.106 |
| 90.49832651543326 | -0.004 | -0.097 | 0.002 | 0.104 |
| 90.66567497210859 | -0.002 | -0.094 | 0.002 | 0.101 |
| 90.83302342878395 | -0.001 | -0.092 | 0.003 | 0.099 |
| 91.00037188545929 | 0 | -0.091 | 0.004 | 0.098 |
| 91.16772034213463 | 0.002 | -0.09 | 0.005 | 0.097 |
| 91.33506879880998 | 0.004 | -0.09 | 0.006 | 0.097 |
| 91.50241725548533 | 0.005 | -0.091 | 0.007 | 0.097 |
| 91.66976571216065 | 0.007 | -0.09 | 0.008 | 0.097 |
| 91.83711416883601 | 0.008 | -0.091 | 0.01 | 0.098 |
| 92.00446262551137 | 0.01 | -0.091 | 0.011 | 0.1 |
| 92.1718110821867 | 0.012 | -0.09 | 0.012 | 0.102 |
| 92.33915953886203 | 0.014 | -0.09 | 0.012 | 0.104 |
| 92.49721085905541 | 0.015 | -0.09 | 0.013 | 0.106 |
| 92.66455931573077 | 0.015 | -0.092 | 0.014 | 0.109 |
| 92.83190777240611 | 0.014 | -0.096 | 0.014 | 0.111 |
| 92.99925622908145 | 0.013 | -0.099 | 0.015 | 0.114 |
| 93.1666046857568 | 0.01 | -0.102 | 0.017 | 0.116 |
| 93.33395314243214 | 0.01 | -0.104 | 0.017 | 0.117 |
| 93.50130159910749 | 0.01 | -0.105 | 0.017 | 0.117 |
| 93.66865005578283 | 0.007 | -0.107 | 0.018 | 0.118 |
| 93.83599851245818 | 0.007 | -0.107 | 0.019 | 0.117 |
| 94.00334696913353 | 0.004 | -0.11 | 0.02 | 0.117 |
| 94.17069542580886 | 0.001 | -0.111 | 0.021 | 0.117 |
| 94.3380438824842 | -0.002 | -0.111 | 0.022 | 0.117 |
| 94.50539233915954 | -0.004 | -0.109 | 0.022 | 0.116 |
| 94.66344365935292 | -0.007 | -0.107 | 0.022 | 0.114 |
| 94.83079211602828 | -0.012 | -0.107 | 0.023 | 0.114 |
| 94.99814057270362 | -0.016 | -0.107 | 0.024 | 0.116 |
| 95.16548902937897 | -0.02 | -0.11 | 0.027 | 0.12 |
| 95.33283748605432 | -0.024 | -0.113 | 0.028 | 0.123 |
| 95.50018594272963 | -0.029 | -0.111 | 0.028 | 0.123 |
| 95.66753439940499 | -0.033 | -0.109 | 0.028 | 0.124 |
| 95.83488285608034 | -0.038 | -0.113 | 0.03 | 0.13 |
| 96.00223131275567 | -0.044 | -0.111 | 0.031 | 0.132 |
| 96.16957976943102 | -0.05 | -0.113 | 0.032 | 0.137 |
| 96.33692822610638 | -0.055 | -0.117 | 0.033 | 0.144 |
| 96.50427668278171 | -0.062 | -0.118 | 0.034 | 0.15 |
| 96.67162513945706 | -0.067 | -0.114 | 0.034 | 0.151 |
| 96.8389735961324 | -0.074 | -0.115 | 0.035 | 0.155 |
| 96.99702491632577 | -0.083 | -0.117 | 0.037 | 0.16 |
| 97.16437337300111 | -0.089 | -0.113 | 0.037 | 0.163 |
| 97.33172182967647 | -0.097 | -0.106 | 0.036 | 0.163 |
| 97.49907028635181 | -0.103 | -0.099 | 0.035 | 0.163 |
| 97.66641874302715 | -0.109 | -0.09 | 0.033 | 0.165 |
| 97.8337671997025 | -0.116 | -0.08 | 0.029 | 0.167 |
| 98.00111565637785 | -0.122 | -0.068 | 0.024 | 0.168 |
| 98.16846411305319 | -0.131 | -0.054 | 0.019 | 0.172 |
| 98.33581256972855 | -0.139 | -0.037 | 0.012 | 0.18 |
| 98.50316102640389 | -0.149 | -0.022 | 0.004 | 0.192 |
| 98.67050948307921 | -0.157 | -0.006 | -0.001 | 0.202 |
| 98.83785793975456 | -0.165 | 0.013 | -0.006 | 0.218 |
| 99.0052063964299 | -0.171 | 0.031 | -0.012 | 0.234 |
| 99.17255485310525 | -0.177 | 0.05 | -0.016 | 0.248 |
| 99.33060617329863 | -0.179 | 0.064 | -0.018 | 0.256 |
| 99.49795462997399 | -0.183 | 0.076 | -0.021 | 0.26 |
| 99.66530308664933 | -0.186 | 0.089 | -0.023 | 0.263 |
| 99.83265154332467 | -0.188 | 0.102 | -0.025 | 0.266 |
| 100.0 | -0.191 | 0.115 | -0.029 | 0.271 |